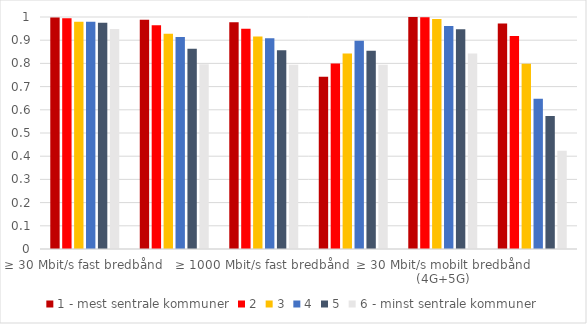
| Category | 1 - mest sentrale kommuner | 2 | 3 | 4 | 5 | 6 - minst sentrale kommuner |
|---|---|---|---|---|---|---|
| ≥ 30 Mbit/s fast bredbånd | 0.998 | 0.994 | 0.979 | 0.979 | 0.975 | 0.948 |
| ≥ 100 Mbit/s fast bredbånd | 0.988 | 0.964 | 0.928 | 0.914 | 0.863 | 0.797 |
| ≥ 1000 Mbit/s fast bredbånd | 0.977 | 0.95 | 0.916 | 0.908 | 0.857 | 0.795 |
| ≥ 1000/1000 Mbit/s fast bredbånd | 0.743 | 0.8 | 0.843 | 0.898 | 0.854 | 0.795 |
| ≥ 30 Mbit/s mobilt bredbånd (4G+5G) | 1 | 0.999 | 0.992 | 0.961 | 0.947 | 0.843 |
| ≥ 100 Mbit/s mobilt bredbånd (4G+5G) | 0.972 | 0.918 | 0.798 | 0.648 | 0.573 | 0.424 |